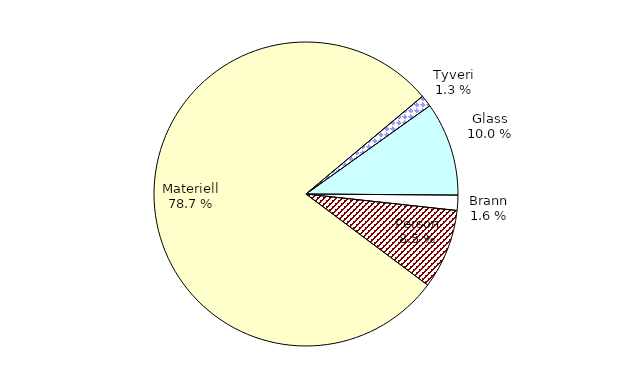
| Category | Series 0 |
|---|---|
| Tyveri | 168.05 |
| Glass | 1337.694 |
| Brann | 217.286 |
| Person | 1139.639 |
| Materiell | 10552.426 |